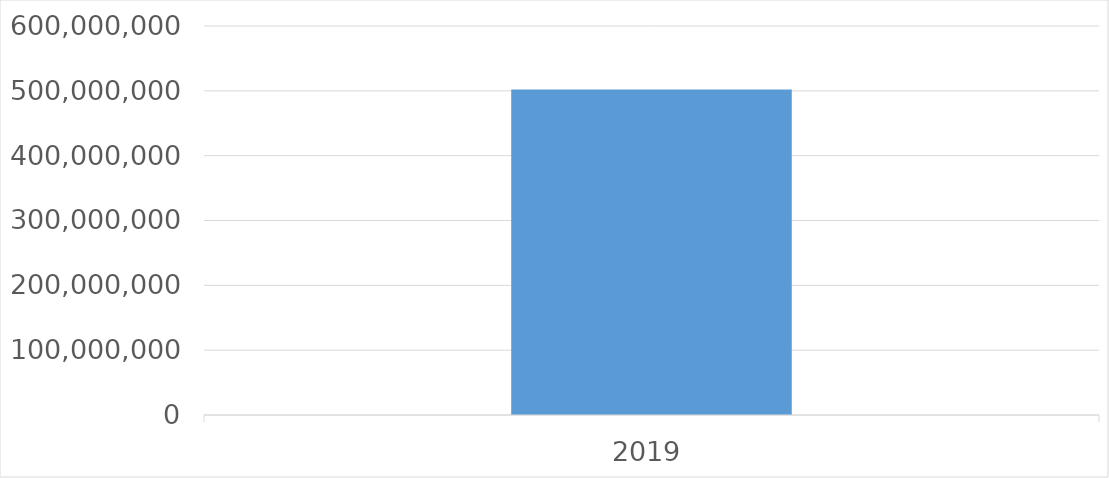
| Category | Series 0 |
|---|---|
| 2019 | 502232993 |